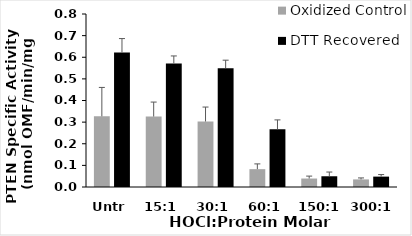
| Category | Oxidized Control | DTT Recovered |
|---|---|---|
| Untr | 0.327 | 0.622 |
| 15:1 | 0.326 | 0.571 |
| 30:1 | 0.303 | 0.55 |
| 60:1 | 0.083 | 0.267 |
| 150:1 | 0.039 | 0.05 |
| 300:1 | 0.035 | 0.048 |